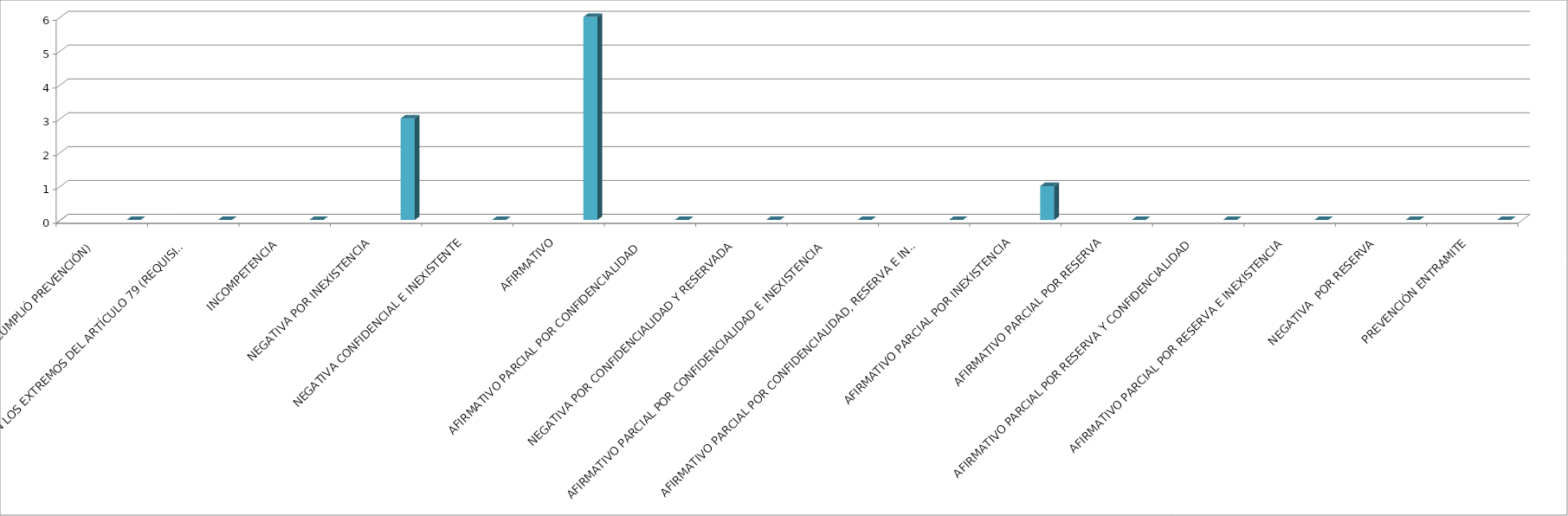
| Category | Series 0 | Series 1 | Series 2 | Series 3 | Series 4 |
|---|---|---|---|---|---|
| SE TIENE POR NO PRESENTADA ( NO CUMPLIÓ PREVENCIÓN) |  |  |  |  | 0 |
| NO CUMPLIO CON LOS EXTREMOS DEL ARTÍCULO 79 (REQUISITOS) |  |  |  |  | 0 |
| INCOMPETENCIA  |  |  |  |  | 0 |
| NEGATIVA POR INEXISTENCIA |  |  |  |  | 3 |
| NEGATIVA CONFIDENCIAL E INEXISTENTE |  |  |  |  | 0 |
| AFIRMATIVO |  |  |  |  | 6 |
| AFIRMATIVO PARCIAL POR CONFIDENCIALIDAD  |  |  |  |  | 0 |
| NEGATIVA POR CONFIDENCIALIDAD Y RESERVADA |  |  |  |  | 0 |
| AFIRMATIVO PARCIAL POR CONFIDENCIALIDAD E INEXISTENCIA |  |  |  |  | 0 |
| AFIRMATIVO PARCIAL POR CONFIDENCIALIDAD, RESERVA E INEXISTENCIA |  |  |  |  | 0 |
| AFIRMATIVO PARCIAL POR INEXISTENCIA |  |  |  |  | 1 |
| AFIRMATIVO PARCIAL POR RESERVA |  |  |  |  | 0 |
| AFIRMATIVO PARCIAL POR RESERVA Y CONFIDENCIALIDAD |  |  |  |  | 0 |
| AFIRMATIVO PARCIAL POR RESERVA E INEXISTENCIA |  |  |  |  | 0 |
| NEGATIVA  POR RESERVA |  |  |  |  | 0 |
| PREVENCIÓN ENTRAMITE |  |  |  |  | 0 |